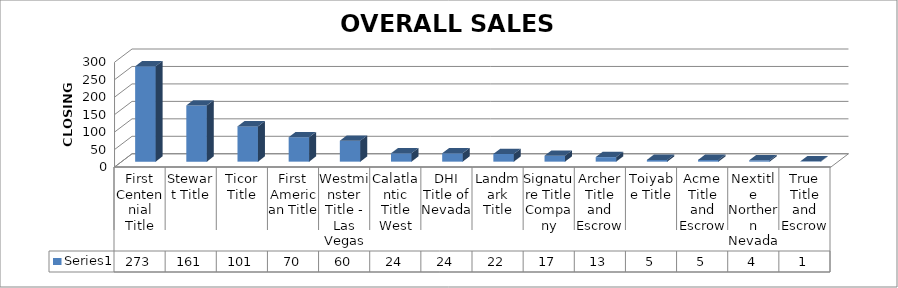
| Category | Series 0 |
|---|---|
| First Centennial Title | 273 |
| Stewart Title | 161 |
| Ticor Title | 101 |
| First American Title | 70 |
| Westminster Title - Las Vegas | 60 |
| Calatlantic Title West | 24 |
| DHI Title of Nevada | 24 |
| Landmark Title | 22 |
| Signature Title Company | 17 |
| Archer Title and Escrow | 13 |
| Toiyabe Title | 5 |
| Acme Title and Escrow | 5 |
| Nextitle Northern Nevada | 4 |
| True Title and Escrow | 1 |